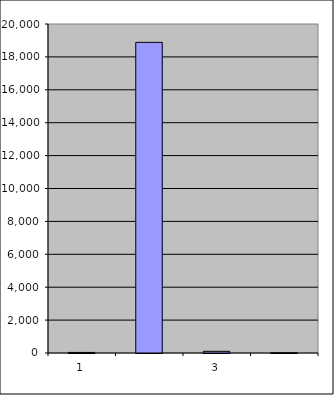
| Category | Series 0 |
|---|---|
| 0 | 34.25 |
| 1 | 18884.256 |
| 2 | 102.367 |
| 3 | 15.713 |